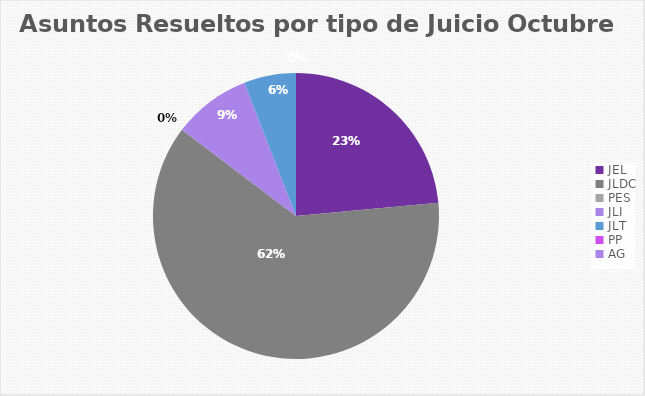
| Category | Asuntos Resueltos por tipo de Juicio  OCTUBRE |
|---|---|
| JEL | 8 |
| JLDC | 21 |
| PES | 0 |
| JLI | 3 |
| JLT | 2 |
| PP | 0 |
| AG | 0 |